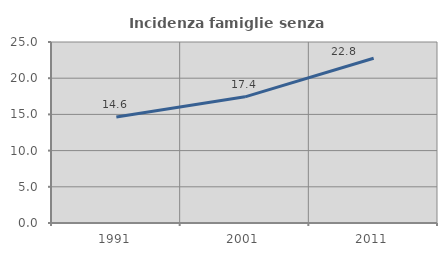
| Category | Incidenza famiglie senza nuclei |
|---|---|
| 1991.0 | 14.634 |
| 2001.0 | 17.427 |
| 2011.0 | 22.76 |